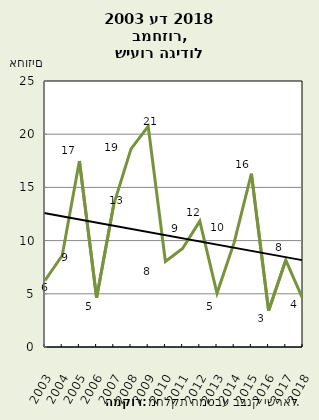
| Category | אחוז הגידול |
|---|---|
| 2003.0 | 6.264 |
| 2004.0 | 8.601 |
| 2005.0 | 17.476 |
| 2006.0 | 4.624 |
| 2007.0 | 13.416 |
| 2008.0 | 18.619 |
| 2009.0 | 20.748 |
| 2010.0 | 8.044 |
| 2011.0 | 9.252 |
| 2012.0 | 11.825 |
| 2013.0 | 5.044 |
| 2014.0 | 9.834 |
| 2015.0 | 16.288 |
| 2016.0 | 3.414 |
| 2017.0 | 8.167 |
| 2018.0 | 4.462 |